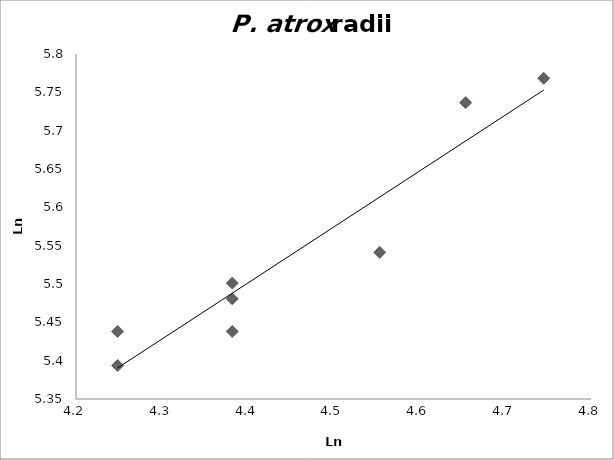
| Category | Series 0 |
|---|---|
| 4.248495242049359 | 5.394 |
| 4.653960350157523 | 5.737 |
| 4.382026634673881 | 5.481 |
| 4.553876891600541 | 5.541 |
| 4.382026634673881 | 5.501 |
| 4.74493212836325 | 5.768 |
| 4.382026634673881 | 5.438 |
| 4.248495242049359 | 5.438 |